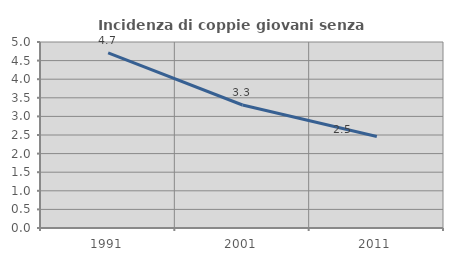
| Category | Incidenza di coppie giovani senza figli |
|---|---|
| 1991.0 | 4.708 |
| 2001.0 | 3.307 |
| 2011.0 | 2.46 |